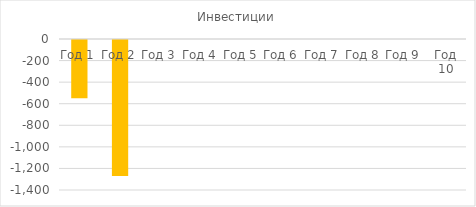
| Category | Инвестиции |
|---|---|
| Год 1 | -540 |
| Год 2 | -1260 |
| Год 3 | 0 |
| Год 4 | 0 |
| Год 5 | 0 |
| Год 6 | 0 |
| Год 7 | 0 |
| Год 8 | 0 |
| Год 9 | 0 |
| Год 10 | 0 |